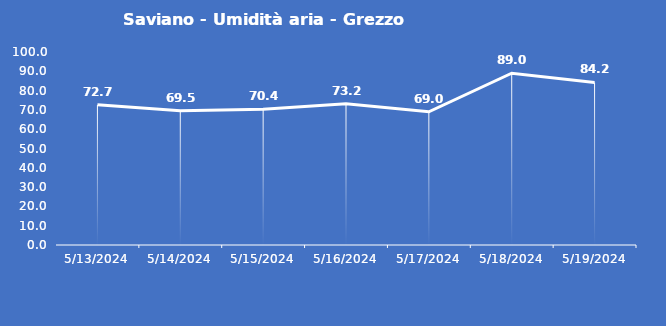
| Category | Saviano - Umidità aria - Grezzo (%) |
|---|---|
| 5/13/24 | 72.7 |
| 5/14/24 | 69.5 |
| 5/15/24 | 70.4 |
| 5/16/24 | 73.2 |
| 5/17/24 | 69 |
| 5/18/24 | 89 |
| 5/19/24 | 84.2 |